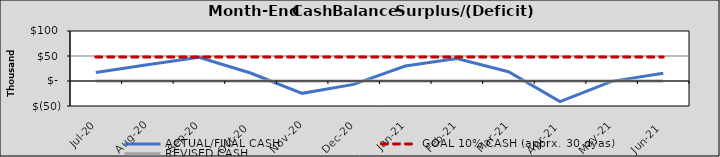
| Category | ACTUAL/FINAL CASH | GOAL 10% CASH (apprx. 30 dyas) | REVISED CASH |
|---|---|---|---|
| 2020-07-01 | 17012.887 | 47925.981 | 0 |
| 2020-08-01 | 32352.719 | 47925.981 | 0 |
| 2020-09-01 | 47302.551 | 47925.981 | 0 |
| 2020-10-02 | 15921.258 | 47925.981 | 0 |
| 2020-11-02 | -24665.856 | 47925.981 | 0 |
| 2020-12-03 | -6812.969 | 47925.981 | 0 |
| 2021-01-03 | 29839.043 | 47925.981 | 0 |
| 2021-02-03 | 45148.875 | 47925.981 | 0 |
| 2021-03-06 | 18499.402 | 47925.981 | 0 |
| 2021-04-06 | -41212.711 | 47925.981 | 0 |
| 2021-05-07 | -699.824 | 47925.981 | 0 |
| 2021-06-07 | 15452.188 | 47925.981 | 0 |